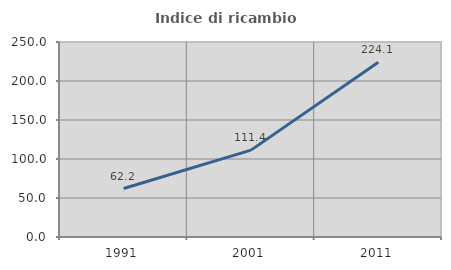
| Category | Indice di ricambio occupazionale  |
|---|---|
| 1991.0 | 62.169 |
| 2001.0 | 111.395 |
| 2011.0 | 224.092 |